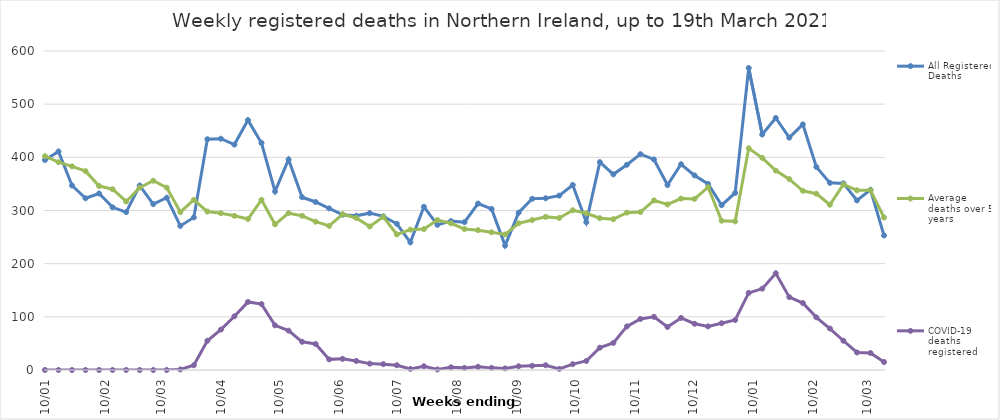
| Category | All Registered Deaths | Average deaths over 5 years | COVID-19 deaths registered |
|---|---|---|---|
| 2020-01-10 | 395 | 402.2 | 0 |
| 2020-01-17 | 411 | 391 | 0 |
| 2020-01-24 | 347 | 383 | 0 |
| 2020-01-31 | 323 | 374 | 0 |
| 2020-02-07 | 332 | 346 | 0 |
| 2020-02-14 | 306 | 340 | 0 |
| 2020-02-21 | 297 | 317 | 0 |
| 2020-02-28 | 347 | 343 | 0 |
| 2020-03-06 | 312 | 356 | 0 |
| 2020-03-13 | 324 | 343 | 0 |
| 2020-03-20 | 271 | 297 | 1 |
| 2020-03-27 | 287 | 320 | 9 |
| 2020-04-03 | 434 | 298 | 55 |
| 2020-04-10 | 435 | 295 | 76 |
| 2020-04-17 | 424 | 290 | 101 |
| 2020-04-24 | 470 | 284 | 128 |
| 2020-05-01 | 427 | 320 | 124 |
| 2020-05-08 | 336 | 274 | 84 |
| 2020-05-15 | 396 | 295 | 74 |
| 2020-05-22 | 325 | 290 | 53 |
| 2020-05-29 | 316 | 279 | 49 |
| 2020-06-05 | 304 | 271 | 20 |
| 2020-06-12 | 292 | 293 | 21 |
| 2020-06-19 | 290 | 286 | 17 |
| 2020-06-26 | 295 | 270 | 12 |
| 2020-07-03 | 289 | 288 | 11 |
| 2020-07-10 | 275 | 255 | 9 |
| 2020-07-17 | 240 | 264 | 2 |
| 2020-07-24 | 307 | 265 | 7 |
| 2020-07-31 | 273 | 282 | 1 |
| 2020-08-07 | 280 | 276 | 5 |
| 2020-08-14 | 278 | 265 | 4 |
| 2020-08-21 | 313 | 263 | 6 |
| 2020-08-28 | 303 | 259 | 4 |
| 2020-09-04 | 234 | 255 | 3 |
| 2020-09-11 | 296 | 276 | 7 |
| 2020-09-18 | 322 | 282 | 8 |
| 2020-09-25 | 323 | 288 | 9 |
| 2020-10-02 | 328 | 286 | 2 |
| 2020-10-09 | 348 | 300.4 | 11 |
| 2020-10-16 | 278 | 294.8 | 17 |
| 2020-10-23 | 391 | 285.6 | 42 |
| 2020-10-30 | 368 | 283.6 | 51 |
| 2020-11-06 | 386 | 296 | 82 |
| 2020-11-13 | 406 | 297 | 96 |
| 2020-11-20 | 396 | 319 | 100 |
| 2020-11-27 | 348 | 311.4 | 81 |
| 2020-12-04 | 387 | 322.4 | 98 |
| 2020-12-11 | 366 | 321.8 | 87 |
| 2020-12-18 | 350 | 343.8 | 82 |
| 2020-12-25 | 310 | 280.8 | 88 |
| 2021-01-01 | 333 | 279.6 | 94 |
| 2021-01-08 | 568 | 417 | 145 |
| 2021-01-15 | 443 | 399 | 153 |
| 2021-01-22 | 474 | 375 | 182 |
| 2021-01-29 | 437 | 359 | 137 |
| 2021-02-05 | 462 | 337 | 126 |
| 2021-02-12 | 382 | 331.6 | 99 |
| 2021-02-19 | 352 | 310.8 | 78 |
| 2021-02-26 | 351 | 349 | 55 |
| 2021-03-05 | 319 | 338 | 33 |
| 2021-03-12 | 339 | 338 | 32 |
| 2021-03-19 | 253 | 286.8 | 15 |